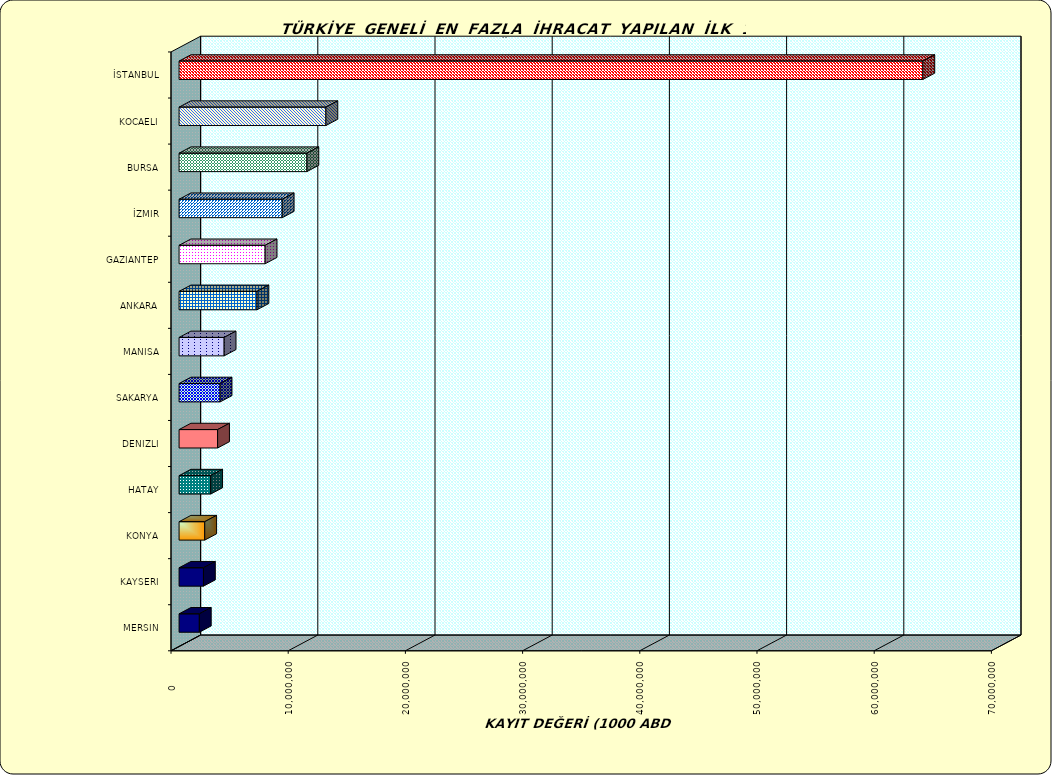
| Category | Series 0 |
|---|---|
| İSTANBUL | 63464265.954 |
| KOCAELI | 12529070.392 |
| BURSA | 10906962.191 |
| İZMIR | 8802045.982 |
| GAZIANTEP | 7344534.416 |
| ANKARA | 6646008.119 |
| MANISA | 3845444.7 |
| SAKARYA | 3500587.393 |
| DENIZLI | 3287409.569 |
| HATAY | 2697445.922 |
| KONYA | 2189292.3 |
| KAYSERI | 2080211.658 |
| MERSIN | 1728635.184 |